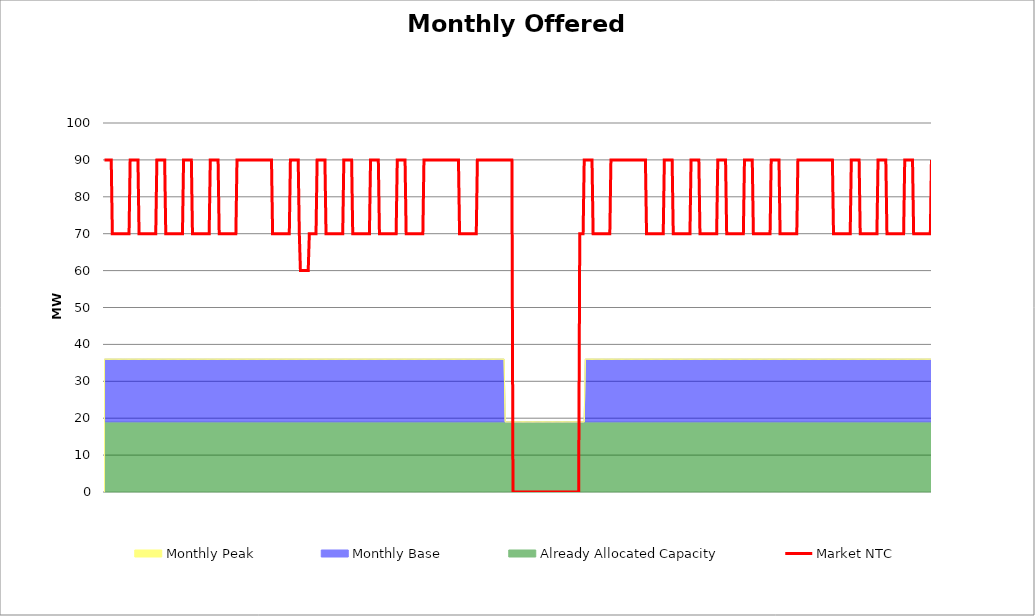
| Category | Market NTC |
|---|---|
| 0 | 90 |
| 1 | 90 |
| 2 | 90 |
| 3 | 90 |
| 4 | 90 |
| 5 | 90 |
| 6 | 90 |
| 7 | 70 |
| 8 | 70 |
| 9 | 70 |
| 10 | 70 |
| 11 | 70 |
| 12 | 70 |
| 13 | 70 |
| 14 | 70 |
| 15 | 70 |
| 16 | 70 |
| 17 | 70 |
| 18 | 70 |
| 19 | 70 |
| 20 | 70 |
| 21 | 70 |
| 22 | 70 |
| 23 | 90 |
| 24 | 90 |
| 25 | 90 |
| 26 | 90 |
| 27 | 90 |
| 28 | 90 |
| 29 | 90 |
| 30 | 90 |
| 31 | 70 |
| 32 | 70 |
| 33 | 70 |
| 34 | 70 |
| 35 | 70 |
| 36 | 70 |
| 37 | 70 |
| 38 | 70 |
| 39 | 70 |
| 40 | 70 |
| 41 | 70 |
| 42 | 70 |
| 43 | 70 |
| 44 | 70 |
| 45 | 70 |
| 46 | 70 |
| 47 | 90 |
| 48 | 90 |
| 49 | 90 |
| 50 | 90 |
| 51 | 90 |
| 52 | 90 |
| 53 | 90 |
| 54 | 90 |
| 55 | 70 |
| 56 | 70 |
| 57 | 70 |
| 58 | 70 |
| 59 | 70 |
| 60 | 70 |
| 61 | 70 |
| 62 | 70 |
| 63 | 70 |
| 64 | 70 |
| 65 | 70 |
| 66 | 70 |
| 67 | 70 |
| 68 | 70 |
| 69 | 70 |
| 70 | 70 |
| 71 | 90 |
| 72 | 90 |
| 73 | 90 |
| 74 | 90 |
| 75 | 90 |
| 76 | 90 |
| 77 | 90 |
| 78 | 90 |
| 79 | 70 |
| 80 | 70 |
| 81 | 70 |
| 82 | 70 |
| 83 | 70 |
| 84 | 70 |
| 85 | 70 |
| 86 | 70 |
| 87 | 70 |
| 88 | 70 |
| 89 | 70 |
| 90 | 70 |
| 91 | 70 |
| 92 | 70 |
| 93 | 70 |
| 94 | 70 |
| 95 | 90 |
| 96 | 90 |
| 97 | 90 |
| 98 | 90 |
| 99 | 90 |
| 100 | 90 |
| 101 | 90 |
| 102 | 90 |
| 103 | 70 |
| 104 | 70 |
| 105 | 70 |
| 106 | 70 |
| 107 | 70 |
| 108 | 70 |
| 109 | 70 |
| 110 | 70 |
| 111 | 70 |
| 112 | 70 |
| 113 | 70 |
| 114 | 70 |
| 115 | 70 |
| 116 | 70 |
| 117 | 70 |
| 118 | 70 |
| 119 | 90 |
| 120 | 90 |
| 121 | 90 |
| 122 | 90 |
| 123 | 90 |
| 124 | 90 |
| 125 | 90 |
| 126 | 90 |
| 127 | 90 |
| 128 | 90 |
| 129 | 90 |
| 130 | 90 |
| 131 | 90 |
| 132 | 90 |
| 133 | 90 |
| 134 | 90 |
| 135 | 90 |
| 136 | 90 |
| 137 | 90 |
| 138 | 90 |
| 139 | 90 |
| 140 | 90 |
| 141 | 90 |
| 142 | 90 |
| 143 | 90 |
| 144 | 90 |
| 145 | 90 |
| 146 | 90 |
| 147 | 90 |
| 148 | 90 |
| 149 | 90 |
| 150 | 90 |
| 151 | 70 |
| 152 | 70 |
| 153 | 70 |
| 154 | 70 |
| 155 | 70 |
| 156 | 70 |
| 157 | 70 |
| 158 | 70 |
| 159 | 70 |
| 160 | 70 |
| 161 | 70 |
| 162 | 70 |
| 163 | 70 |
| 164 | 70 |
| 165 | 70 |
| 166 | 70 |
| 167 | 90 |
| 168 | 90 |
| 169 | 90 |
| 170 | 90 |
| 171 | 90 |
| 172 | 90 |
| 173 | 90 |
| 174 | 90 |
| 175 | 70 |
| 176 | 60 |
| 177 | 60 |
| 178 | 60 |
| 179 | 60 |
| 180 | 60 |
| 181 | 60 |
| 182 | 60 |
| 183 | 60 |
| 184 | 70 |
| 185 | 70 |
| 186 | 70 |
| 187 | 70 |
| 188 | 70 |
| 189 | 70 |
| 190 | 70 |
| 191 | 90 |
| 192 | 90 |
| 193 | 90 |
| 194 | 90 |
| 195 | 90 |
| 196 | 90 |
| 197 | 90 |
| 198 | 90 |
| 199 | 70 |
| 200 | 70 |
| 201 | 70 |
| 202 | 70 |
| 203 | 70 |
| 204 | 70 |
| 205 | 70 |
| 206 | 70 |
| 207 | 70 |
| 208 | 70 |
| 209 | 70 |
| 210 | 70 |
| 211 | 70 |
| 212 | 70 |
| 213 | 70 |
| 214 | 70 |
| 215 | 90 |
| 216 | 90 |
| 217 | 90 |
| 218 | 90 |
| 219 | 90 |
| 220 | 90 |
| 221 | 90 |
| 222 | 90 |
| 223 | 70 |
| 224 | 70 |
| 225 | 70 |
| 226 | 70 |
| 227 | 70 |
| 228 | 70 |
| 229 | 70 |
| 230 | 70 |
| 231 | 70 |
| 232 | 70 |
| 233 | 70 |
| 234 | 70 |
| 235 | 70 |
| 236 | 70 |
| 237 | 70 |
| 238 | 70 |
| 239 | 90 |
| 240 | 90 |
| 241 | 90 |
| 242 | 90 |
| 243 | 90 |
| 244 | 90 |
| 245 | 90 |
| 246 | 90 |
| 247 | 70 |
| 248 | 70 |
| 249 | 70 |
| 250 | 70 |
| 251 | 70 |
| 252 | 70 |
| 253 | 70 |
| 254 | 70 |
| 255 | 70 |
| 256 | 70 |
| 257 | 70 |
| 258 | 70 |
| 259 | 70 |
| 260 | 70 |
| 261 | 70 |
| 262 | 70 |
| 263 | 90 |
| 264 | 90 |
| 265 | 90 |
| 266 | 90 |
| 267 | 90 |
| 268 | 90 |
| 269 | 90 |
| 270 | 90 |
| 271 | 70 |
| 272 | 70 |
| 273 | 70 |
| 274 | 70 |
| 275 | 70 |
| 276 | 70 |
| 277 | 70 |
| 278 | 70 |
| 279 | 70 |
| 280 | 70 |
| 281 | 70 |
| 282 | 70 |
| 283 | 70 |
| 284 | 70 |
| 285 | 70 |
| 286 | 70 |
| 287 | 90 |
| 288 | 90 |
| 289 | 90 |
| 290 | 90 |
| 291 | 90 |
| 292 | 90 |
| 293 | 90 |
| 294 | 90 |
| 295 | 90 |
| 296 | 90 |
| 297 | 90 |
| 298 | 90 |
| 299 | 90 |
| 300 | 90 |
| 301 | 90 |
| 302 | 90 |
| 303 | 90 |
| 304 | 90 |
| 305 | 90 |
| 306 | 90 |
| 307 | 90 |
| 308 | 90 |
| 309 | 90 |
| 310 | 90 |
| 311 | 90 |
| 312 | 90 |
| 313 | 90 |
| 314 | 90 |
| 315 | 90 |
| 316 | 90 |
| 317 | 90 |
| 318 | 90 |
| 319 | 70 |
| 320 | 70 |
| 321 | 70 |
| 322 | 70 |
| 323 | 70 |
| 324 | 70 |
| 325 | 70 |
| 326 | 70 |
| 327 | 70 |
| 328 | 70 |
| 329 | 70 |
| 330 | 70 |
| 331 | 70 |
| 332 | 70 |
| 333 | 70 |
| 334 | 70 |
| 335 | 90 |
| 336 | 90 |
| 337 | 90 |
| 338 | 90 |
| 339 | 90 |
| 340 | 90 |
| 341 | 90 |
| 342 | 90 |
| 343 | 90 |
| 344 | 90 |
| 345 | 90 |
| 346 | 90 |
| 347 | 90 |
| 348 | 90 |
| 349 | 90 |
| 350 | 90 |
| 351 | 90 |
| 352 | 90 |
| 353 | 90 |
| 354 | 90 |
| 355 | 90 |
| 356 | 90 |
| 357 | 90 |
| 358 | 90 |
| 359 | 90 |
| 360 | 90 |
| 361 | 90 |
| 362 | 90 |
| 363 | 90 |
| 364 | 90 |
| 365 | 90 |
| 366 | 90 |
| 367 | 0 |
| 368 | 0 |
| 369 | 0 |
| 370 | 0 |
| 371 | 0 |
| 372 | 0 |
| 373 | 0 |
| 374 | 0 |
| 375 | 0 |
| 376 | 0 |
| 377 | 0 |
| 378 | 0 |
| 379 | 0 |
| 380 | 0 |
| 381 | 0 |
| 382 | 0 |
| 383 | 0 |
| 384 | 0 |
| 385 | 0 |
| 386 | 0 |
| 387 | 0 |
| 388 | 0 |
| 389 | 0 |
| 390 | 0 |
| 391 | 0 |
| 392 | 0 |
| 393 | 0 |
| 394 | 0 |
| 395 | 0 |
| 396 | 0 |
| 397 | 0 |
| 398 | 0 |
| 399 | 0 |
| 400 | 0 |
| 401 | 0 |
| 402 | 0 |
| 403 | 0 |
| 404 | 0 |
| 405 | 0 |
| 406 | 0 |
| 407 | 0 |
| 408 | 0 |
| 409 | 0 |
| 410 | 0 |
| 411 | 0 |
| 412 | 0 |
| 413 | 0 |
| 414 | 0 |
| 415 | 0 |
| 416 | 0 |
| 417 | 0 |
| 418 | 0 |
| 419 | 0 |
| 420 | 0 |
| 421 | 0 |
| 422 | 0 |
| 423 | 0 |
| 424 | 0 |
| 425 | 0 |
| 426 | 0 |
| 427 | 70 |
| 428 | 70 |
| 429 | 70 |
| 430 | 70 |
| 431 | 90 |
| 432 | 90 |
| 433 | 90 |
| 434 | 90 |
| 435 | 90 |
| 436 | 90 |
| 437 | 90 |
| 438 | 90 |
| 439 | 70 |
| 440 | 70 |
| 441 | 70 |
| 442 | 70 |
| 443 | 70 |
| 444 | 70 |
| 445 | 70 |
| 446 | 70 |
| 447 | 70 |
| 448 | 70 |
| 449 | 70 |
| 450 | 70 |
| 451 | 70 |
| 452 | 70 |
| 453 | 70 |
| 454 | 70 |
| 455 | 90 |
| 456 | 90 |
| 457 | 90 |
| 458 | 90 |
| 459 | 90 |
| 460 | 90 |
| 461 | 90 |
| 462 | 90 |
| 463 | 90 |
| 464 | 90 |
| 465 | 90 |
| 466 | 90 |
| 467 | 90 |
| 468 | 90 |
| 469 | 90 |
| 470 | 90 |
| 471 | 90 |
| 472 | 90 |
| 473 | 90 |
| 474 | 90 |
| 475 | 90 |
| 476 | 90 |
| 477 | 90 |
| 478 | 90 |
| 479 | 90 |
| 480 | 90 |
| 481 | 90 |
| 482 | 90 |
| 483 | 90 |
| 484 | 90 |
| 485 | 90 |
| 486 | 90 |
| 487 | 70 |
| 488 | 70 |
| 489 | 70 |
| 490 | 70 |
| 491 | 70 |
| 492 | 70 |
| 493 | 70 |
| 494 | 70 |
| 495 | 70 |
| 496 | 70 |
| 497 | 70 |
| 498 | 70 |
| 499 | 70 |
| 500 | 70 |
| 501 | 70 |
| 502 | 70 |
| 503 | 90 |
| 504 | 90 |
| 505 | 90 |
| 506 | 90 |
| 507 | 90 |
| 508 | 90 |
| 509 | 90 |
| 510 | 90 |
| 511 | 70 |
| 512 | 70 |
| 513 | 70 |
| 514 | 70 |
| 515 | 70 |
| 516 | 70 |
| 517 | 70 |
| 518 | 70 |
| 519 | 70 |
| 520 | 70 |
| 521 | 70 |
| 522 | 70 |
| 523 | 70 |
| 524 | 70 |
| 525 | 70 |
| 526 | 70 |
| 527 | 90 |
| 528 | 90 |
| 529 | 90 |
| 530 | 90 |
| 531 | 90 |
| 532 | 90 |
| 533 | 90 |
| 534 | 90 |
| 535 | 70 |
| 536 | 70 |
| 537 | 70 |
| 538 | 70 |
| 539 | 70 |
| 540 | 70 |
| 541 | 70 |
| 542 | 70 |
| 543 | 70 |
| 544 | 70 |
| 545 | 70 |
| 546 | 70 |
| 547 | 70 |
| 548 | 70 |
| 549 | 70 |
| 550 | 70 |
| 551 | 90 |
| 552 | 90 |
| 553 | 90 |
| 554 | 90 |
| 555 | 90 |
| 556 | 90 |
| 557 | 90 |
| 558 | 90 |
| 559 | 70 |
| 560 | 70 |
| 561 | 70 |
| 562 | 70 |
| 563 | 70 |
| 564 | 70 |
| 565 | 70 |
| 566 | 70 |
| 567 | 70 |
| 568 | 70 |
| 569 | 70 |
| 570 | 70 |
| 571 | 70 |
| 572 | 70 |
| 573 | 70 |
| 574 | 70 |
| 575 | 90 |
| 576 | 90 |
| 577 | 90 |
| 578 | 90 |
| 579 | 90 |
| 580 | 90 |
| 581 | 90 |
| 582 | 90 |
| 583 | 70 |
| 584 | 70 |
| 585 | 70 |
| 586 | 70 |
| 587 | 70 |
| 588 | 70 |
| 589 | 70 |
| 590 | 70 |
| 591 | 70 |
| 592 | 70 |
| 593 | 70 |
| 594 | 70 |
| 595 | 70 |
| 596 | 70 |
| 597 | 70 |
| 598 | 70 |
| 599 | 90 |
| 600 | 90 |
| 601 | 90 |
| 602 | 90 |
| 603 | 90 |
| 604 | 90 |
| 605 | 90 |
| 606 | 90 |
| 607 | 70 |
| 608 | 70 |
| 609 | 70 |
| 610 | 70 |
| 611 | 70 |
| 612 | 70 |
| 613 | 70 |
| 614 | 70 |
| 615 | 70 |
| 616 | 70 |
| 617 | 70 |
| 618 | 70 |
| 619 | 70 |
| 620 | 70 |
| 621 | 70 |
| 622 | 70 |
| 623 | 90 |
| 624 | 90 |
| 625 | 90 |
| 626 | 90 |
| 627 | 90 |
| 628 | 90 |
| 629 | 90 |
| 630 | 90 |
| 631 | 90 |
| 632 | 90 |
| 633 | 90 |
| 634 | 90 |
| 635 | 90 |
| 636 | 90 |
| 637 | 90 |
| 638 | 90 |
| 639 | 90 |
| 640 | 90 |
| 641 | 90 |
| 642 | 90 |
| 643 | 90 |
| 644 | 90 |
| 645 | 90 |
| 646 | 90 |
| 647 | 90 |
| 648 | 90 |
| 649 | 90 |
| 650 | 90 |
| 651 | 90 |
| 652 | 90 |
| 653 | 90 |
| 654 | 90 |
| 655 | 70 |
| 656 | 70 |
| 657 | 70 |
| 658 | 70 |
| 659 | 70 |
| 660 | 70 |
| 661 | 70 |
| 662 | 70 |
| 663 | 70 |
| 664 | 70 |
| 665 | 70 |
| 666 | 70 |
| 667 | 70 |
| 668 | 70 |
| 669 | 70 |
| 670 | 70 |
| 671 | 90 |
| 672 | 90 |
| 673 | 90 |
| 674 | 90 |
| 675 | 90 |
| 676 | 90 |
| 677 | 90 |
| 678 | 90 |
| 679 | 70 |
| 680 | 70 |
| 681 | 70 |
| 682 | 70 |
| 683 | 70 |
| 684 | 70 |
| 685 | 70 |
| 686 | 70 |
| 687 | 70 |
| 688 | 70 |
| 689 | 70 |
| 690 | 70 |
| 691 | 70 |
| 692 | 70 |
| 693 | 70 |
| 694 | 70 |
| 695 | 90 |
| 696 | 90 |
| 697 | 90 |
| 698 | 90 |
| 699 | 90 |
| 700 | 90 |
| 701 | 90 |
| 702 | 90 |
| 703 | 70 |
| 704 | 70 |
| 705 | 70 |
| 706 | 70 |
| 707 | 70 |
| 708 | 70 |
| 709 | 70 |
| 710 | 70 |
| 711 | 70 |
| 712 | 70 |
| 713 | 70 |
| 714 | 70 |
| 715 | 70 |
| 716 | 70 |
| 717 | 70 |
| 718 | 70 |
| 719 | 90 |
| 720 | 90 |
| 721 | 90 |
| 722 | 90 |
| 723 | 90 |
| 724 | 90 |
| 725 | 90 |
| 726 | 90 |
| 727 | 70 |
| 728 | 70 |
| 729 | 70 |
| 730 | 70 |
| 731 | 70 |
| 732 | 70 |
| 733 | 70 |
| 734 | 70 |
| 735 | 70 |
| 736 | 70 |
| 737 | 70 |
| 738 | 70 |
| 739 | 70 |
| 740 | 70 |
| 741 | 70 |
| 742 | 70 |
| 743 | 90 |